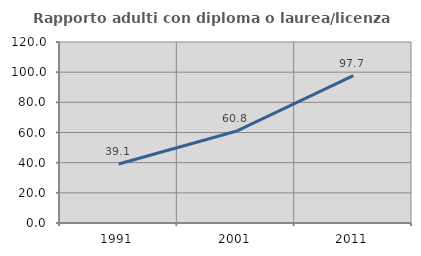
| Category | Rapporto adulti con diploma o laurea/licenza media  |
|---|---|
| 1991.0 | 39.149 |
| 2001.0 | 60.795 |
| 2011.0 | 97.679 |